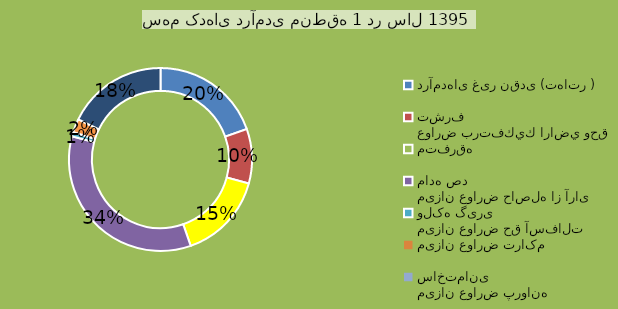
| Category | Series 0 | Series 1 |
|---|---|---|
| درآمدهای غیر نقدی (تهاتر ) |  | 95181591 |
| عوارض برتفكيك اراضي وحق تشرف |  | 46730295 |
| متفرقه  |  | 74890717 |
| میزان عوارض حاصله از آرای ماده صد |  | 167212552 |
| میزان عوارض حق آسفالت ولکه گیری |  | 3752276 |
| میزان عوارض تراکم |  | 11548117 |
| میزان عوارض پروانه ساختمانی |  | 86284440 |